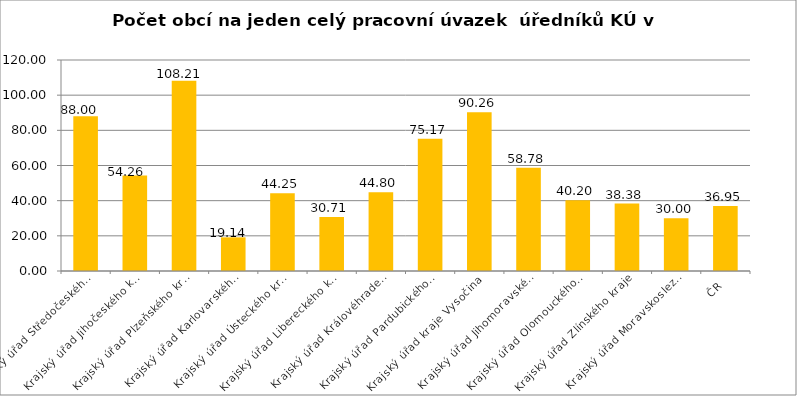
| Category | Počet obcí na jeden celý pracovní úvazek  úředníků KÚ |
|---|---|
| Krajský úřad Středočeského kraje | 88 |
| Krajský úřad Jihočeského kraje | 54.26 |
| Krajský úřad Plzeňského kraje | 108.21 |
| Krajský úřad Karlovarského kraje | 19.14 |
| Krajský úřad Ústeckého kraje | 44.25 |
| Krajský úřad Libereckého kraje | 30.71 |
| Krajský úřad Královéhradeckého kraje | 44.8 |
| Krajský úřad Pardubického kraje | 75.17 |
| Krajský úřad kraje Vysočina | 90.26 |
| Krajský úřad Jihomoravského kraje | 58.78 |
| Krajský úřad Olomouckého kraje | 40.2 |
| Krajský úřad Zlínského kraje | 38.38 |
| Krajský úřad Moravskoslezského kraje | 30 |
| ČR | 36.95 |